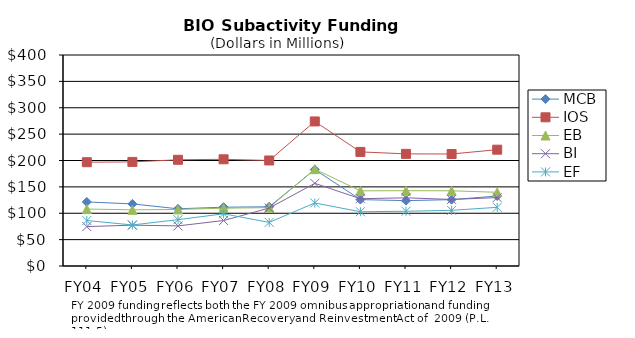
| Category | MCB | IOS | EB | BI | EF |
|---|---|---|---|---|---|
| FY04 | 121.42 | 196.76 | 107.94 | 74.68 | 86.24 |
| FY05 | 117.74 | 197.36 | 106.47 | 77.41 | 77.8 |
| FY06 | 108.46 | 201.34 | 107.21 | 76.02 | 87.87 |
| FY07 | 111.5 | 202.31 | 109.6 | 86.21 | 98.92 |
| FY08 | 112.28 | 200.04 | 110.71 | 109.86 | 82.73 |
| FY09 | 182.81 | 274.05 | 183.6 | 156.69 | 119.48 |
| FY10 | 125.9 | 216.32 | 142.5 | 127.54 | 102.85 |
| FY11 | 123.93 | 212.56 | 142.72 | 129.28 | 103.79 |
| FY12 | 125.79 | 212.33 | 142.56 | 126.18 | 105.52 |
| FY13 | 132.68 | 220.52 | 139.73 | 129.68 | 111.25 |